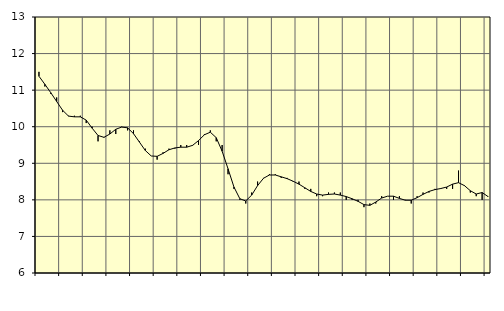
| Category | Piggar | Tillverkning av verkstadsvaror, SNI 25-30, 33 |
|---|---|---|
| nan | 11.5 | 11.38 |
| 1.0 | 11.1 | 11.16 |
| 1.0 | 10.9 | 10.93 |
| 1.0 | 10.8 | 10.69 |
| nan | 10.4 | 10.45 |
| 2.0 | 10.3 | 10.29 |
| 2.0 | 10.3 | 10.27 |
| 2.0 | 10.3 | 10.27 |
| nan | 10.1 | 10.18 |
| 3.0 | 10 | 9.96 |
| 3.0 | 9.6 | 9.76 |
| 3.0 | 9.7 | 9.71 |
| nan | 9.9 | 9.8 |
| 4.0 | 9.8 | 9.93 |
| 4.0 | 10 | 9.99 |
| 4.0 | 9.9 | 9.97 |
| nan | 9.9 | 9.81 |
| 5.0 | 9.6 | 9.58 |
| 5.0 | 9.4 | 9.35 |
| 5.0 | 9.2 | 9.2 |
| nan | 9.1 | 9.19 |
| 6.0 | 9.3 | 9.27 |
| 6.0 | 9.4 | 9.37 |
| 6.0 | 9.4 | 9.42 |
| nan | 9.5 | 9.44 |
| 7.0 | 9.5 | 9.44 |
| 7.0 | 9.5 | 9.49 |
| 7.0 | 9.5 | 9.62 |
| nan | 9.8 | 9.78 |
| 8.0 | 9.9 | 9.85 |
| 8.0 | 9.6 | 9.7 |
| 8.0 | 9.5 | 9.33 |
| nan | 8.7 | 8.85 |
| 9.0 | 8.3 | 8.35 |
| 9.0 | 8 | 8.03 |
| 9.0 | 7.9 | 7.97 |
| nan | 8.2 | 8.13 |
| 10.0 | 8.5 | 8.39 |
| 10.0 | 8.6 | 8.59 |
| 10.0 | 8.7 | 8.68 |
| nan | 8.7 | 8.68 |
| 11.0 | 8.6 | 8.63 |
| 11.0 | 8.6 | 8.58 |
| 11.0 | 8.5 | 8.51 |
| nan | 8.5 | 8.43 |
| 12.0 | 8.3 | 8.33 |
| 12.0 | 8.3 | 8.23 |
| 12.0 | 8.1 | 8.16 |
| nan | 8.1 | 8.13 |
| 13.0 | 8.2 | 8.15 |
| 13.0 | 8.2 | 8.16 |
| 13.0 | 8.2 | 8.13 |
| nan | 8 | 8.09 |
| 14.0 | 8 | 8.03 |
| 14.0 | 8 | 7.96 |
| 14.0 | 7.8 | 7.87 |
| nan | 7.9 | 7.85 |
| 15.0 | 7.9 | 7.94 |
| 15.0 | 8.1 | 8.05 |
| 15.0 | 8.1 | 8.1 |
| nan | 8 | 8.1 |
| 16.0 | 8.1 | 8.04 |
| 16.0 | 8 | 7.99 |
| 16.0 | 7.9 | 7.99 |
| nan | 8.1 | 8.06 |
| 17.0 | 8.2 | 8.15 |
| 17.0 | 8.2 | 8.23 |
| 17.0 | 8.3 | 8.28 |
| nan | 8.3 | 8.31 |
| 18.0 | 8.3 | 8.35 |
| 18.0 | 8.3 | 8.43 |
| 18.0 | 8.8 | 8.47 |
| nan | 8.4 | 8.39 |
| 19.0 | 8.2 | 8.25 |
| 19.0 | 8.1 | 8.16 |
| 19.0 | 8 | 8.2 |
| nan | 8.1 | 8.09 |